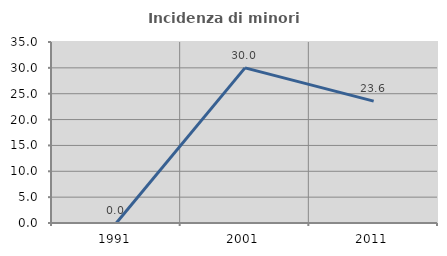
| Category | Incidenza di minori stranieri |
|---|---|
| 1991.0 | 0 |
| 2001.0 | 30 |
| 2011.0 | 23.563 |